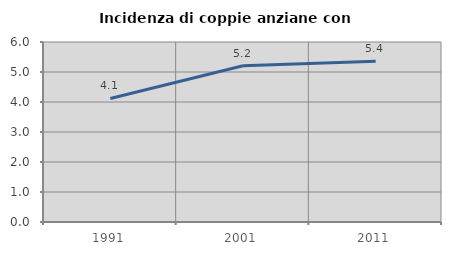
| Category | Incidenza di coppie anziane con figli |
|---|---|
| 1991.0 | 4.118 |
| 2001.0 | 5.21 |
| 2011.0 | 5.355 |